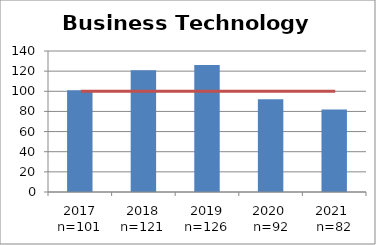
| Category | Enrollment |
|---|---|
| 2017 n=101 | 101 |
| 2018 n=121 | 121 |
| 2019 n=126 | 126 |
| 2020  n=92 | 92 |
| 2021  n=82 | 82 |